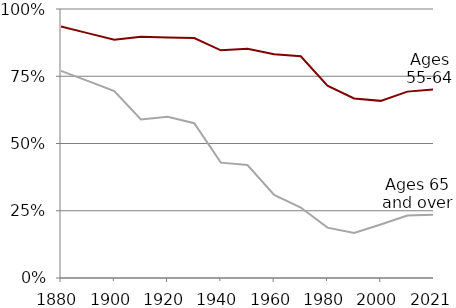
| Category | Ages 55-64 | Ages 65 and over |
|---|---|---|
| 1880.0 | 0.935 | 0.77 |
| 1890.0 | 0.91 | 0.733 |
| 1900.0 | 0.885 | 0.695 |
| 1910.0 | 0.897 | 0.589 |
| 1920.0 | 0.894 | 0.599 |
| 1930.0 | 0.892 | 0.576 |
| 1940.0 | 0.846 | 0.429 |
| 1950.0 | 0.852 | 0.42 |
| 1960.0 | 0.831 | 0.309 |
| 1970.0 | 0.824 | 0.262 |
| 1980.0 | 0.715 | 0.187 |
| 1990.0 | 0.668 | 0.168 |
| 2000.0 | 0.658 | 0.199 |
| 2010.0 | 0.693 | 0.232 |
| 2021.0 | 0.701 | 0.235 |